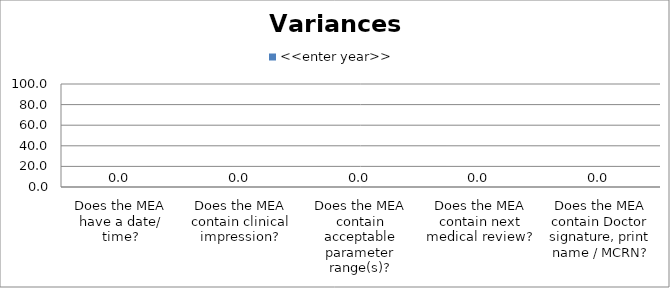
| Category | <<enter year>> |
|---|---|
| Does the MEA have a date/ time? | 0 |
| Does the MEA contain clinical impression? | 0 |
| Does the MEA contain acceptable parameter range(s)? | 0 |
| Does the MEA contain next medical review? | 0 |
| Does the MEA contain Doctor signature, print name / MCRN? | 0 |